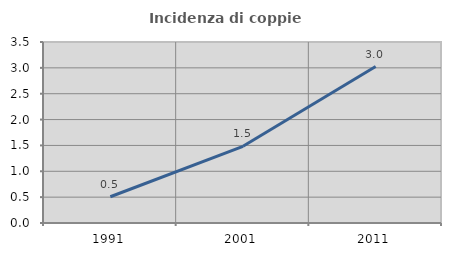
| Category | Incidenza di coppie miste |
|---|---|
| 1991.0 | 0.507 |
| 2001.0 | 1.483 |
| 2011.0 | 3.026 |